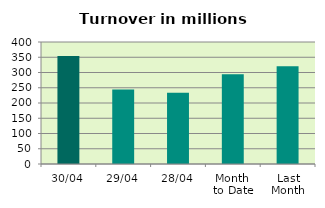
| Category | Series 0 |
|---|---|
| 30/04 | 354.503 |
| 29/04 | 244.173 |
| 28/04 | 233.31 |
| Month 
to Date | 294.539 |
| Last
Month | 320.663 |